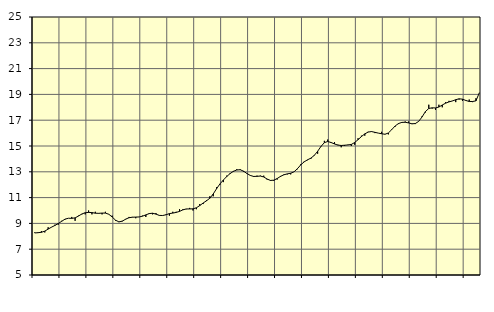
| Category | Piggar | Finansiell verksamhet, företagstjänster, SNI 64-82 |
|---|---|---|
| nan | 8.3 | 8.26 |
| 87.0 | 8.3 | 8.28 |
| 87.0 | 8.4 | 8.31 |
| 87.0 | 8.3 | 8.4 |
| nan | 8.7 | 8.56 |
| 88.0 | 8.7 | 8.71 |
| 88.0 | 8.9 | 8.84 |
| 88.0 | 8.9 | 8.99 |
| nan | 9.2 | 9.16 |
| 89.0 | 9.3 | 9.33 |
| 89.0 | 9.4 | 9.4 |
| 89.0 | 9.5 | 9.39 |
| nan | 9.2 | 9.43 |
| 90.0 | 9.6 | 9.57 |
| 90.0 | 9.7 | 9.73 |
| 90.0 | 9.7 | 9.83 |
| nan | 10 | 9.85 |
| 91.0 | 9.7 | 9.84 |
| 91.0 | 9.9 | 9.79 |
| 91.0 | 9.8 | 9.78 |
| nan | 9.7 | 9.8 |
| 92.0 | 9.9 | 9.8 |
| 92.0 | 9.7 | 9.71 |
| 92.0 | 9.6 | 9.5 |
| nan | 9.2 | 9.25 |
| 93.0 | 9.1 | 9.12 |
| 93.0 | 9.2 | 9.17 |
| 93.0 | 9.3 | 9.33 |
| nan | 9.5 | 9.44 |
| 94.0 | 9.5 | 9.48 |
| 94.0 | 9.4 | 9.49 |
| 94.0 | 9.5 | 9.5 |
| nan | 9.6 | 9.56 |
| 95.0 | 9.5 | 9.66 |
| 95.0 | 9.8 | 9.76 |
| 95.0 | 9.7 | 9.79 |
| nan | 9.8 | 9.72 |
| 96.0 | 9.6 | 9.62 |
| 96.0 | 9.6 | 9.61 |
| 96.0 | 9.7 | 9.67 |
| nan | 9.6 | 9.76 |
| 97.0 | 9.9 | 9.8 |
| 97.0 | 9.9 | 9.85 |
| 97.0 | 10.1 | 9.93 |
| nan | 10.1 | 10.05 |
| 98.0 | 10.1 | 10.12 |
| 98.0 | 10.2 | 10.12 |
| 98.0 | 10 | 10.13 |
| nan | 10.1 | 10.21 |
| 99.0 | 10.5 | 10.38 |
| 99.0 | 10.5 | 10.58 |
| 99.0 | 10.8 | 10.75 |
| nan | 11.1 | 10.95 |
| 0.0 | 11.1 | 11.28 |
| 0.0 | 11.8 | 11.69 |
| 0.0 | 12 | 12.06 |
| nan | 12.2 | 12.36 |
| 1.0 | 12.7 | 12.63 |
| 1.0 | 12.9 | 12.86 |
| 1.0 | 13 | 13.04 |
| nan | 13.2 | 13.14 |
| 2.0 | 13.2 | 13.16 |
| 2.0 | 13 | 13.05 |
| 2.0 | 12.9 | 12.87 |
| nan | 12.7 | 12.72 |
| 3.0 | 12.6 | 12.64 |
| 3.0 | 12.7 | 12.65 |
| 3.0 | 12.7 | 12.67 |
| nan | 12.7 | 12.6 |
| 4.0 | 12.4 | 12.44 |
| 4.0 | 12.3 | 12.33 |
| 4.0 | 12.3 | 12.35 |
| nan | 12.4 | 12.48 |
| 5.0 | 12.6 | 12.65 |
| 5.0 | 12.8 | 12.77 |
| 5.0 | 12.8 | 12.84 |
| nan | 12.8 | 12.89 |
| 6.0 | 13 | 13 |
| 6.0 | 13.2 | 13.24 |
| 6.0 | 13.6 | 13.54 |
| nan | 13.8 | 13.77 |
| 7.0 | 13.9 | 13.93 |
| 7.0 | 14 | 14.06 |
| 7.0 | 14.3 | 14.27 |
| nan | 14.4 | 14.59 |
| 8.0 | 15 | 14.97 |
| 8.0 | 15.4 | 15.26 |
| 8.0 | 15.5 | 15.35 |
| nan | 15.3 | 15.27 |
| 9.0 | 15.3 | 15.16 |
| 9.0 | 15.1 | 15.07 |
| 9.0 | 14.9 | 15.04 |
| nan | 15 | 15.06 |
| 10.0 | 15.1 | 15.08 |
| 10.0 | 15 | 15.12 |
| 10.0 | 15.1 | 15.27 |
| nan | 15.6 | 15.49 |
| 11.0 | 15.8 | 15.73 |
| 11.0 | 15.8 | 15.94 |
| 11.0 | 16.1 | 16.08 |
| nan | 16.1 | 16.12 |
| 12.0 | 16 | 16.06 |
| 12.0 | 16 | 16 |
| 12.0 | 16.1 | 15.95 |
| nan | 15.9 | 15.91 |
| 13.0 | 15.9 | 16.01 |
| 13.0 | 16.3 | 16.27 |
| 13.0 | 16.5 | 16.55 |
| nan | 16.7 | 16.74 |
| 14.0 | 16.8 | 16.83 |
| 14.0 | 16.9 | 16.84 |
| 14.0 | 16.9 | 16.79 |
| nan | 16.7 | 16.72 |
| 15.0 | 16.7 | 16.74 |
| 15.0 | 16.9 | 16.91 |
| 15.0 | 17.3 | 17.25 |
| nan | 17.6 | 17.67 |
| 16.0 | 18.2 | 17.91 |
| 16.0 | 17.9 | 17.96 |
| 16.0 | 17.8 | 17.95 |
| nan | 18.2 | 18.02 |
| 17.0 | 18 | 18.18 |
| 17.0 | 18.4 | 18.32 |
| 17.0 | 18.5 | 18.42 |
| nan | 18.5 | 18.49 |
| 18.0 | 18.4 | 18.59 |
| 18.0 | 18.6 | 18.66 |
| 18.0 | 18.5 | 18.63 |
| nan | 18.5 | 18.53 |
| 19.0 | 18.6 | 18.45 |
| 19.0 | 18.4 | 18.45 |
| 19.0 | 18.7 | 18.5 |
| nan | 19.1 | 19.12 |